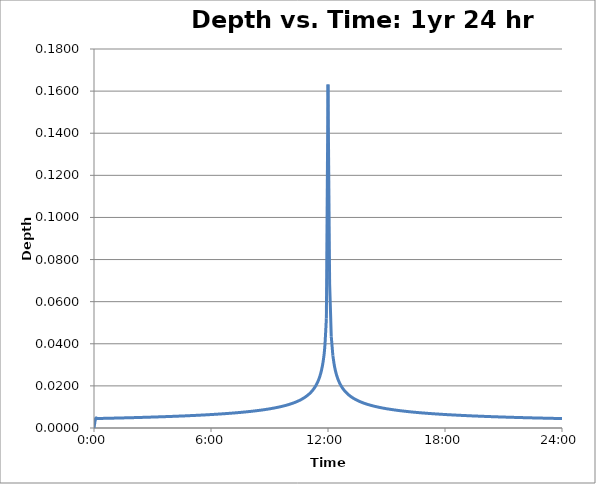
| Category | "HCE (CAP) Storms" |
|---|---|
| 0.0 | 0 |
| 0.003472222222222222 | 0.004 |
| 0.006944444444444444 | 0.005 |
| 0.0104166666666667 | 0.005 |
| 0.0138888888888889 | 0.005 |
| 0.0173611111111111 | 0.005 |
| 0.0208333333333333 | 0.005 |
| 0.0243055555555556 | 0.005 |
| 0.0277777777777778 | 0.005 |
| 0.03125 | 0.005 |
| 0.0347222222222222 | 0.005 |
| 0.0381944444444444 | 0.005 |
| 0.0416666666666667 | 0.005 |
| 0.0451388888888889 | 0.005 |
| 0.0486111111111111 | 0.005 |
| 0.0520833333333333 | 0.005 |
| 0.0555555555555556 | 0.005 |
| 0.0590277777777778 | 0.005 |
| 0.0625 | 0.005 |
| 0.0659722222222222 | 0.005 |
| 0.0694444444444444 | 0.005 |
| 0.0729166666666667 | 0.005 |
| 0.0763888888888889 | 0.005 |
| 0.0798611111111111 | 0.005 |
| 0.0833333333333333 | 0.005 |
| 0.0868055555555556 | 0.005 |
| 0.0902777777777778 | 0.005 |
| 0.09375 | 0.005 |
| 0.0972222222222222 | 0.005 |
| 0.100694444444444 | 0.005 |
| 0.104166666666667 | 0.005 |
| 0.107638888888889 | 0.005 |
| 0.111111111111111 | 0.005 |
| 0.114583333333333 | 0.005 |
| 0.118055555555556 | 0.005 |
| 0.121527777777778 | 0.005 |
| 0.125 | 0.005 |
| 0.128472222222222 | 0.005 |
| 0.131944444444444 | 0.005 |
| 0.135416666666667 | 0.005 |
| 0.138888888888889 | 0.005 |
| 0.142361111111111 | 0.005 |
| 0.145833333333333 | 0.005 |
| 0.149305555555556 | 0.005 |
| 0.152777777777778 | 0.005 |
| 0.15625 | 0.005 |
| 0.159722222222222 | 0.005 |
| 0.163194444444444 | 0.005 |
| 0.166666666666667 | 0.006 |
| 0.170138888888889 | 0.006 |
| 0.173611111111111 | 0.006 |
| 0.177083333333333 | 0.006 |
| 0.180555555555556 | 0.006 |
| 0.184027777777778 | 0.006 |
| 0.1875 | 0.006 |
| 0.190972222222222 | 0.006 |
| 0.194444444444444 | 0.006 |
| 0.197916666666667 | 0.006 |
| 0.201388888888889 | 0.006 |
| 0.204861111111111 | 0.006 |
| 0.208333333333333 | 0.006 |
| 0.211805555555556 | 0.006 |
| 0.215277777777778 | 0.006 |
| 0.21875 | 0.006 |
| 0.222222222222222 | 0.006 |
| 0.225694444444444 | 0.006 |
| 0.229166666666667 | 0.006 |
| 0.232638888888889 | 0.006 |
| 0.236111111111111 | 0.006 |
| 0.239583333333333 | 0.006 |
| 0.243055555555556 | 0.006 |
| 0.246527777777778 | 0.006 |
| 0.25 | 0.006 |
| 0.253472222222222 | 0.006 |
| 0.256944444444444 | 0.006 |
| 0.260416666666667 | 0.007 |
| 0.263888888888889 | 0.007 |
| 0.267361111111111 | 0.007 |
| 0.270833333333333 | 0.007 |
| 0.274305555555556 | 0.007 |
| 0.277777777777778 | 0.007 |
| 0.28125 | 0.007 |
| 0.284722222222222 | 0.007 |
| 0.288194444444444 | 0.007 |
| 0.291666666666667 | 0.007 |
| 0.295138888888889 | 0.007 |
| 0.298611111111111 | 0.007 |
| 0.302083333333333 | 0.007 |
| 0.305555555555556 | 0.007 |
| 0.309027777777778 | 0.007 |
| 0.3125 | 0.007 |
| 0.315972222222222 | 0.007 |
| 0.319444444444444 | 0.008 |
| 0.322916666666667 | 0.008 |
| 0.326388888888889 | 0.008 |
| 0.329861111111111 | 0.008 |
| 0.333333333333333 | 0.008 |
| 0.336805555555556 | 0.008 |
| 0.340277777777778 | 0.008 |
| 0.34375 | 0.008 |
| 0.347222222222222 | 0.008 |
| 0.350694444444444 | 0.008 |
| 0.354166666666667 | 0.008 |
| 0.357638888888889 | 0.009 |
| 0.361111111111111 | 0.009 |
| 0.364583333333333 | 0.009 |
| 0.368055555555556 | 0.009 |
| 0.371527777777778 | 0.009 |
| 0.375 | 0.009 |
| 0.378472222222222 | 0.009 |
| 0.381944444444444 | 0.009 |
| 0.385416666666667 | 0.01 |
| 0.388888888888889 | 0.01 |
| 0.392361111111111 | 0.01 |
| 0.395833333333333 | 0.01 |
| 0.399305555555556 | 0.01 |
| 0.402777777777778 | 0.01 |
| 0.40625 | 0.011 |
| 0.409722222222222 | 0.011 |
| 0.413194444444444 | 0.011 |
| 0.416666666666667 | 0.011 |
| 0.420138888888889 | 0.011 |
| 0.423611111111111 | 0.012 |
| 0.427083333333333 | 0.012 |
| 0.430555555555556 | 0.012 |
| 0.434027777777778 | 0.013 |
| 0.4375 | 0.013 |
| 0.440972222222222 | 0.013 |
| 0.444444444444444 | 0.014 |
| 0.447916666666667 | 0.014 |
| 0.451388888888889 | 0.015 |
| 0.454861111111111 | 0.015 |
| 0.458333333333333 | 0.016 |
| 0.461805555555556 | 0.017 |
| 0.465277777777778 | 0.017 |
| 0.46875 | 0.018 |
| 0.472222222222222 | 0.019 |
| 0.475694444444444 | 0.021 |
| 0.479166666666667 | 0.022 |
| 0.482638888888889 | 0.025 |
| 0.486111111111111 | 0.027 |
| 0.489583333333333 | 0.032 |
| 0.493055555555556 | 0.038 |
| 0.496527777777778 | 0.052 |
| 0.5 | 0.163 |
| 0.503472222222222 | 0.069 |
| 0.506944444444444 | 0.044 |
| 0.510416666666667 | 0.034 |
| 0.513888888888889 | 0.029 |
| 0.517361111111111 | 0.026 |
| 0.520833333333333 | 0.023 |
| 0.524305555555556 | 0.022 |
| 0.527777777777778 | 0.02 |
| 0.53125 | 0.019 |
| 0.534722222222222 | 0.018 |
| 0.538194444444444 | 0.017 |
| 0.541666666666667 | 0.016 |
| 0.545138888888889 | 0.016 |
| 0.548611111111111 | 0.015 |
| 0.552083333333333 | 0.014 |
| 0.555555555555556 | 0.014 |
| 0.559027777777778 | 0.014 |
| 0.5625 | 0.013 |
| 0.565972222222222 | 0.013 |
| 0.569444444444444 | 0.012 |
| 0.572916666666667 | 0.012 |
| 0.576388888888889 | 0.012 |
| 0.579861111111111 | 0.012 |
| 0.583333333333333 | 0.011 |
| 0.586805555555555 | 0.011 |
| 0.590277777777778 | 0.011 |
| 0.59375 | 0.011 |
| 0.597222222222222 | 0.01 |
| 0.600694444444444 | 0.01 |
| 0.604166666666667 | 0.01 |
| 0.607638888888889 | 0.01 |
| 0.611111111111111 | 0.01 |
| 0.614583333333333 | 0.01 |
| 0.618055555555555 | 0.009 |
| 0.621527777777778 | 0.009 |
| 0.625 | 0.009 |
| 0.628472222222222 | 0.009 |
| 0.631944444444444 | 0.009 |
| 0.635416666666667 | 0.009 |
| 0.638888888888889 | 0.009 |
| 0.642361111111111 | 0.009 |
| 0.645833333333333 | 0.008 |
| 0.649305555555555 | 0.008 |
| 0.652777777777778 | 0.008 |
| 0.65625 | 0.008 |
| 0.659722222222222 | 0.008 |
| 0.663194444444444 | 0.008 |
| 0.666666666666667 | 0.008 |
| 0.670138888888889 | 0.008 |
| 0.673611111111111 | 0.008 |
| 0.677083333333333 | 0.008 |
| 0.680555555555555 | 0.008 |
| 0.684027777777778 | 0.007 |
| 0.6875 | 0.007 |
| 0.690972222222222 | 0.007 |
| 0.694444444444444 | 0.007 |
| 0.697916666666667 | 0.007 |
| 0.701388888888889 | 0.007 |
| 0.704861111111111 | 0.007 |
| 0.708333333333333 | 0.007 |
| 0.711805555555555 | 0.007 |
| 0.715277777777778 | 0.007 |
| 0.71875 | 0.007 |
| 0.722222222222222 | 0.007 |
| 0.725694444444444 | 0.007 |
| 0.729166666666667 | 0.007 |
| 0.732638888888889 | 0.007 |
| 0.736111111111111 | 0.007 |
| 0.739583333333333 | 0.007 |
| 0.743055555555555 | 0.007 |
| 0.746527777777778 | 0.006 |
| 0.75 | 0.006 |
| 0.753472222222222 | 0.006 |
| 0.756944444444444 | 0.006 |
| 0.760416666666667 | 0.006 |
| 0.763888888888889 | 0.006 |
| 0.767361111111111 | 0.006 |
| 0.770833333333333 | 0.006 |
| 0.774305555555555 | 0.006 |
| 0.777777777777778 | 0.006 |
| 0.78125 | 0.006 |
| 0.784722222222222 | 0.006 |
| 0.788194444444444 | 0.006 |
| 0.791666666666667 | 0.006 |
| 0.795138888888889 | 0.006 |
| 0.798611111111111 | 0.006 |
| 0.802083333333333 | 0.006 |
| 0.805555555555555 | 0.006 |
| 0.809027777777778 | 0.006 |
| 0.8125 | 0.006 |
| 0.815972222222222 | 0.006 |
| 0.819444444444444 | 0.006 |
| 0.822916666666667 | 0.006 |
| 0.826388888888889 | 0.006 |
| 0.829861111111111 | 0.006 |
| 0.833333333333333 | 0.006 |
| 0.836805555555555 | 0.005 |
| 0.840277777777778 | 0.005 |
| 0.84375 | 0.005 |
| 0.847222222222222 | 0.005 |
| 0.850694444444444 | 0.005 |
| 0.854166666666667 | 0.005 |
| 0.857638888888889 | 0.005 |
| 0.861111111111111 | 0.005 |
| 0.864583333333333 | 0.005 |
| 0.868055555555555 | 0.005 |
| 0.871527777777778 | 0.005 |
| 0.875 | 0.005 |
| 0.878472222222222 | 0.005 |
| 0.881944444444444 | 0.005 |
| 0.885416666666667 | 0.005 |
| 0.888888888888889 | 0.005 |
| 0.892361111111111 | 0.005 |
| 0.895833333333333 | 0.005 |
| 0.899305555555555 | 0.005 |
| 0.902777777777778 | 0.005 |
| 0.90625 | 0.005 |
| 0.909722222222222 | 0.005 |
| 0.913194444444444 | 0.005 |
| 0.916666666666667 | 0.005 |
| 0.920138888888889 | 0.005 |
| 0.923611111111111 | 0.005 |
| 0.927083333333333 | 0.005 |
| 0.930555555555555 | 0.005 |
| 0.934027777777778 | 0.005 |
| 0.9375 | 0.005 |
| 0.940972222222222 | 0.005 |
| 0.944444444444444 | 0.005 |
| 0.947916666666667 | 0.005 |
| 0.951388888888889 | 0.005 |
| 0.954861111111111 | 0.005 |
| 0.958333333333333 | 0.005 |
| 0.961805555555555 | 0.005 |
| 0.965277777777778 | 0.005 |
| 0.96875 | 0.005 |
| 0.972222222222222 | 0.005 |
| 0.975694444444444 | 0.005 |
| 0.979166666666667 | 0.005 |
| 0.982638888888889 | 0.005 |
| 0.986111111111111 | 0.005 |
| 0.989583333333333 | 0.005 |
| 0.993055555555555 | 0.005 |
| 0.996527777777778 | 0.005 |
| 1.0 | 0.004 |